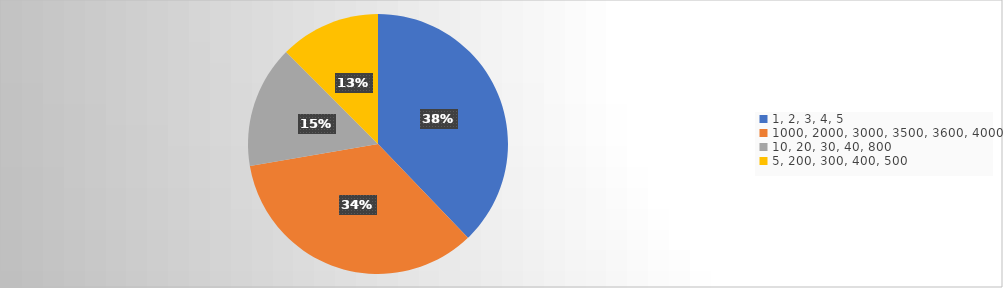
| Category | Series 0 |
|---|---|
| 1, 2, 3, 4, 5 | 112 |
| 1000, 2000, 3000, 3500, 3600, 4000 | 102 |
| 10, 20, 30, 40, 800 | 45 |
| 5, 200, 300, 400, 500 | 37 |